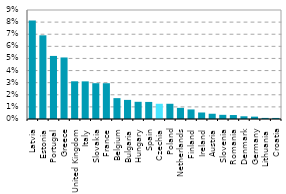
| Category | Series 0 |
|---|---|
| Latvia | 0.081 |
| Estonia | 0.069 |
| Portugal | 0.052 |
| Greece | 0.051 |
| United Kingdom | 0.031 |
| Italy | 0.031 |
| Slovakia | 0.03 |
| France | 0.03 |
| Belgium | 0.017 |
| Bulgaria | 0.016 |
| Hungary | 0.014 |
| Spain | 0.014 |
| Czechia | 0.013 |
| Poland | 0.013 |
| Netherlands | 0.009 |
| Finland | 0.008 |
| Ireland | 0.005 |
| Austria | 0.004 |
| Slovenia | 0.003 |
| Romania | 0.003 |
| Denmark | 0.002 |
| Germany | 0.002 |
| Lithuania | 0.001 |
| Croatia | 0.001 |